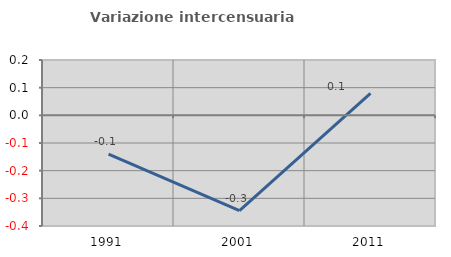
| Category | Variazione intercensuaria annua |
|---|---|
| 1991.0 | -0.14 |
| 2001.0 | -0.345 |
| 2011.0 | 0.08 |